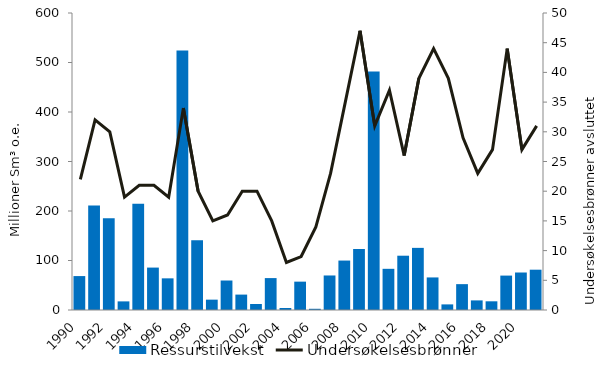
| Category | Ressurstilvekst |
|---|---|
| 1990.0 | 68.53 |
| 1991.0 | 211.32 |
| 1992.0 | 185.44 |
| 1993.0 | 17.4 |
| 1994.0 | 214.57 |
| 1995.0 | 85.69 |
| 1996.0 | 63.95 |
| 1997.0 | 524.13 |
| 1998.0 | 140.93 |
| 1999.0 | 20.91 |
| 2000.0 | 59.57 |
| 2001.0 | 31.12 |
| 2002.0 | 12.11 |
| 2003.0 | 64.46 |
| 2004.0 | 4.1 |
| 2005.0 | 57.28 |
| 2006.0 | 2.45 |
| 2007.0 | 69.75 |
| 2008.0 | 99.88 |
| 2009.0 | 123.28 |
| 2010.0 | 481.87 |
| 2011.0 | 83.2 |
| 2012.0 | 109.68 |
| 2013.0 | 125.52 |
| 2014.0 | 65.79 |
| 2015.0 | 11.33 |
| 2016.0 | 52.24 |
| 2017.0 | 19.4 |
| 2018.0 | 17.57 |
| 2019.0 | 69.52 |
| 2020.0 | 75.76 |
| 2021.0 | 81.42 |